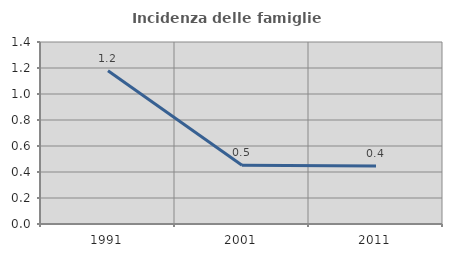
| Category | Incidenza delle famiglie numerose |
|---|---|
| 1991.0 | 1.179 |
| 2001.0 | 0.451 |
| 2011.0 | 0.445 |